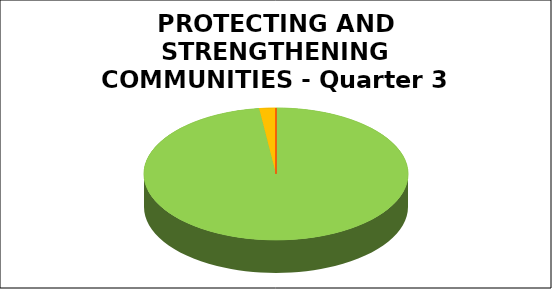
| Category | Series 0 |
|---|---|
| Green | 0.98 |
| Amber | 0.02 |
| Red | 0 |